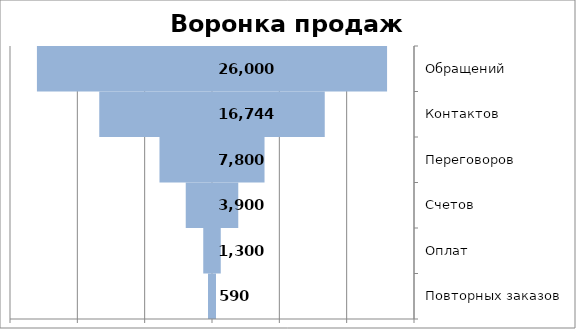
| Category | Кол-во | Series 1 |
|---|---|---|
| Обращений | 26000 | -26000 |
| Контактов | 16744 | -16744 |
| Переговоров | 7800 | -7800 |
| Счетов | 3900 | -3900 |
| Оплат | 1300 | -1300 |
| Повторных заказов | 590 | -590 |